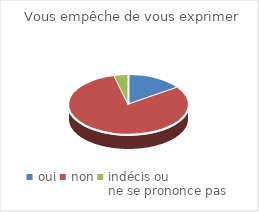
| Category | Vous empêche de vous exprimer |
|---|---|
| oui | 12 |
| non | 63 |
| indécis ou 
ne se prononce pas | 3 |